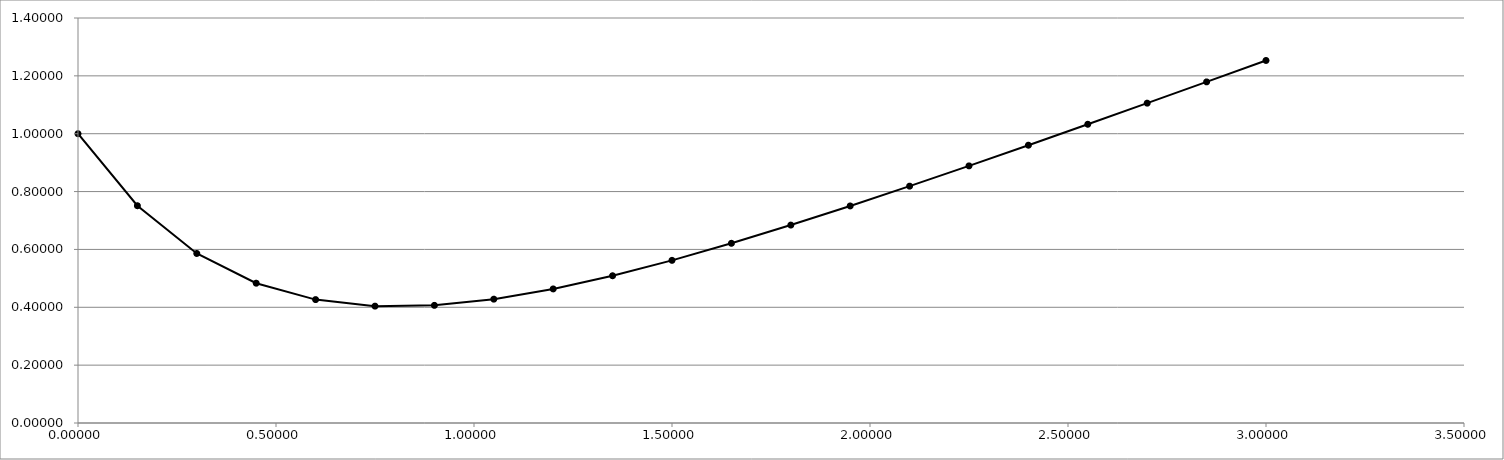
| Category | Series 0 |
|---|---|
| 0.0 | 1 |
| 0.15 | 0.751 |
| 0.3 | 0.586 |
| 0.44999999999999996 | 0.483 |
| 0.6 | 0.427 |
| 0.75 | 0.404 |
| 0.9 | 0.407 |
| 1.05 | 0.428 |
| 1.2 | 0.463 |
| 1.3499999999999999 | 0.509 |
| 1.4999999999999998 | 0.562 |
| 1.6499999999999997 | 0.621 |
| 1.7999999999999996 | 0.684 |
| 1.9499999999999995 | 0.75 |
| 2.0999999999999996 | 0.819 |
| 2.2499999999999996 | 0.889 |
| 2.3999999999999995 | 0.96 |
| 2.5499999999999994 | 1.033 |
| 2.6999999999999993 | 1.106 |
| 2.849999999999999 | 1.179 |
| 2.999999999999999 | 1.253 |